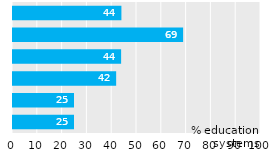
| Category | Agency |
|---|---|
| ECEC | 44.118 |
| Primary-upper secondary | 69 |
| Post-secondary, non-tertiary | 44 |
| Tertiary | 42 |
| Adult education | 25 |
| Not known | 25 |